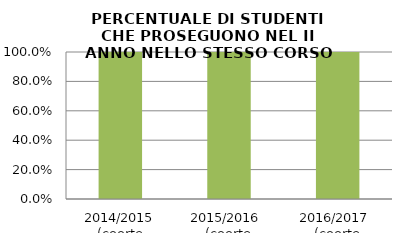
| Category | 2014/2015 (coorte 2013/14) 2015/2016  (coorte 2014/15) 2016/2017  (coorte 2015/16) |
|---|---|
| 2014/2015 (coorte 2013/14) | 1 |
| 2015/2016  (coorte 2014/15) | 1 |
| 2016/2017  (coorte 2015/16) | 1 |